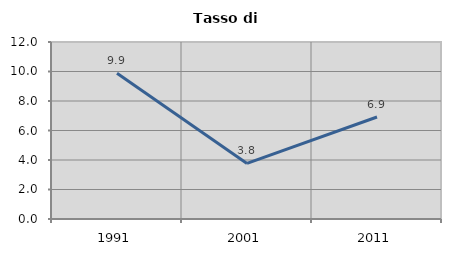
| Category | Tasso di disoccupazione   |
|---|---|
| 1991.0 | 9.875 |
| 2001.0 | 3.766 |
| 2011.0 | 6.915 |